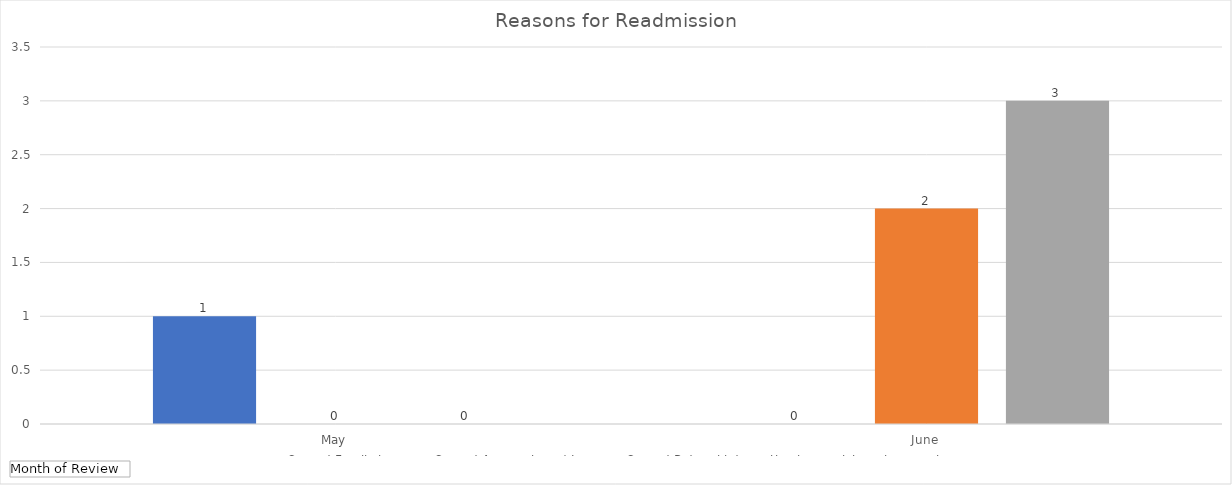
| Category | Sum of Family issues | Sum of Agency based Issues | Sum of Referral information incomplete or inaccurate |
|---|---|---|---|
| May | 1 | 0 | 0 |
| June | 0 | 2 | 3 |